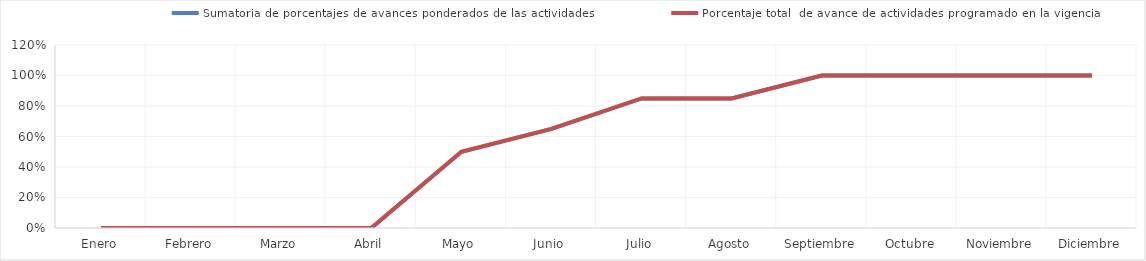
| Category | Sumatoria de porcentajes de avances ponderados de las actividades | Porcentaje total  de avance de actividades programado en la vigencia |
|---|---|---|
| 0 | 0 | 0 |
| 1 | 0 | 0 |
| 2 | 0 | 0 |
| 3 | 0 | 0 |
| 4 | 0.5 | 0.5 |
| 5 | 0.65 | 0.65 |
| 6 | 0.85 | 0.85 |
| 7 | 0.85 | 0.85 |
| 8 | 1 | 1 |
| 9 | 1 | 1 |
| 10 | 1 | 1 |
| 11 | 1 | 1 |